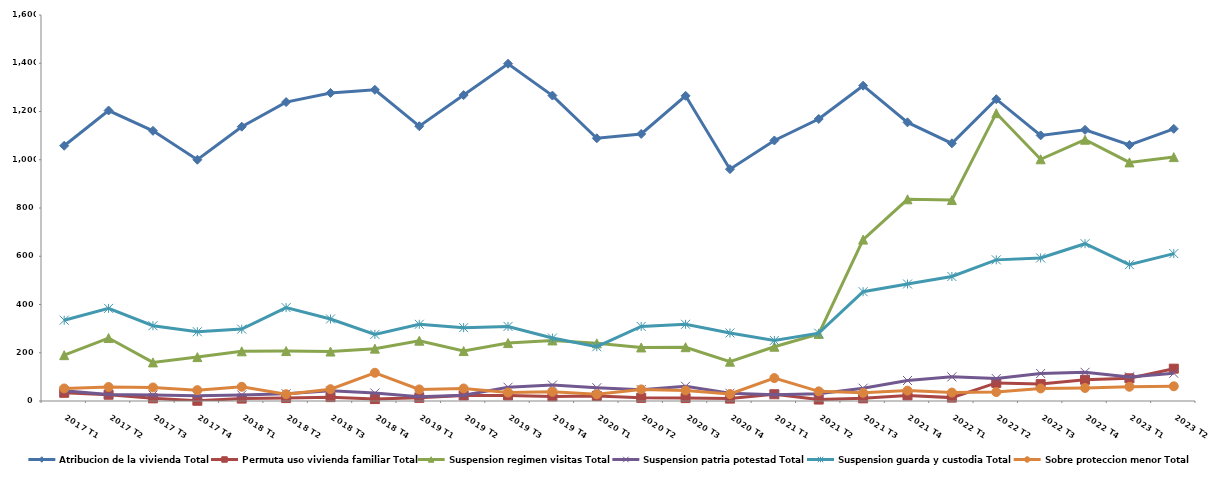
| Category | Atribucion de la vivienda Total | Permuta uso vivienda familiar Total | Suspension regimen visitas Total | Suspension patria potestad Total | Suspension guarda y custodia Total | Sobre proteccion menor Total |
|---|---|---|---|---|---|---|
| 2017 T1 | 1058 | 34 | 190 | 42 | 335 | 52 |
| 2017 T2 | 1204 | 26 | 261 | 27 | 384 | 58 |
| 2017 T3 | 1120 | 11 | 160 | 25 | 312 | 56 |
| 2017 T4 | 1000 | 1 | 182 | 22 | 287 | 45 |
| 2018 T1 | 1137 | 10 | 206 | 25 | 298 | 59 |
| 2018 T2 | 1239 | 12 | 207 | 30 | 387 | 28 |
| 2018 T3 | 1277 | 16 | 205 | 42 | 340 | 49 |
| 2018 T4 | 1290 | 8 | 217 | 33 | 276 | 117 |
| 2019 T1 | 1139 | 13 | 250 | 18 | 318 | 48 |
| 2019 T2 | 1268 | 23 | 207 | 24 | 304 | 52 |
| 2019 T3 | 1398 | 23 | 240 | 57 | 309 | 35 |
| 2019 T4 | 1266 | 19 | 251 | 66 | 261 | 38 |
| 2020 T1 | 1089 | 21 | 239 | 55 | 225 | 28 |
| 2020 T2 | 1107 | 13 | 222 | 47 | 309 | 48 |
| 2020 T3 | 1265 | 12 | 223 | 61 | 318 | 44 |
| 2020 T4 | 961 | 10 | 163 | 32 | 282 | 29 |
| 2021 T1 | 1080 | 28 | 225 | 26 | 251 | 95 |
| 2021 T2 | 1169 | 6 | 278 | 30 | 281 | 40 |
| 2021 T3 | 1307 | 11 | 669 | 53 | 453 | 34 |
| 2021 T4 | 1155 | 23 | 836 | 85 | 485 | 43 |
| 2022 T1 | 1068 | 14 | 833 | 100 | 516 | 35 |
| 2022 T2 | 1251 | 75 | 1193 | 93 | 585 | 37 |
| 2022 T3 | 1101 | 70 | 1002 | 114 | 593 | 52 |
| 2022 T4 | 1124 | 88 | 1083 | 119 | 652 | 54 |
| 2023 T1 | 1061 | 94 | 989 | 100 | 565 | 59 |
| 2023 T2 | 1128 | 134 | 1011 | 115 | 611 | 61 |